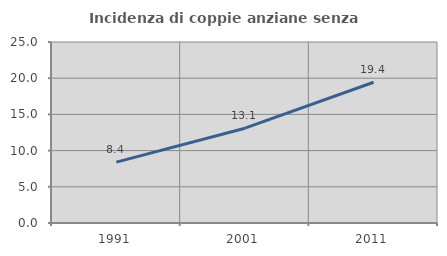
| Category | Incidenza di coppie anziane senza figli  |
|---|---|
| 1991.0 | 8.403 |
| 2001.0 | 13.095 |
| 2011.0 | 19.444 |